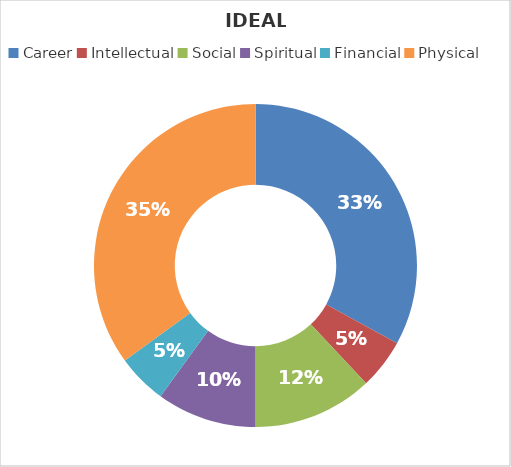
| Category | Series 0 |
|---|---|
| Career | 33 |
| Intellectual | 5 |
| Social | 12 |
| Spiritual | 10 |
| Financial | 5 |
| Physical | 35 |